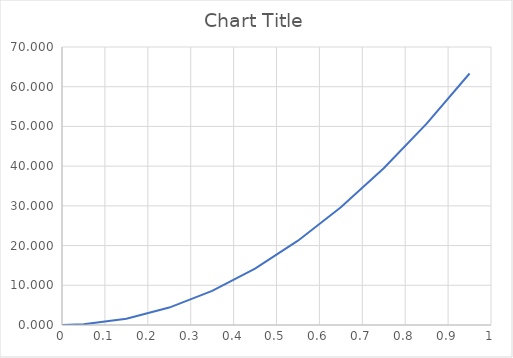
| Category | Series 0 |
|---|---|
| 0.95 | 63.33 |
| 0.85 | 50.699 |
| 0.75 | 39.471 |
| 0.65 | 29.647 |
| 0.55 | 21.227 |
| 0.45000000000000007 | 14.21 |
| 0.3500000000000001 | 8.596 |
| 0.2500000000000001 | 4.386 |
| 0.1500000000000001 | 1.579 |
| 0.0500000000000001 | 0.175 |
| 0.0 | 0 |